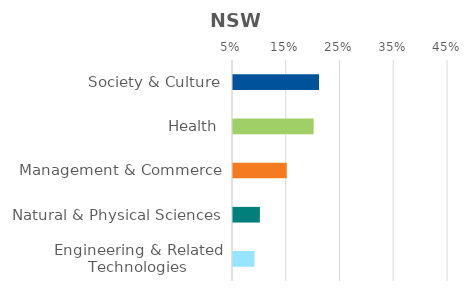
| Category | Series 0 |
|---|---|
| Society & Culture | 0.21 |
| Health | 0.2 |
| Management & Commerce | 0.15 |
| Natural & Physical Sciences | 0.1 |
| Engineering & Related Technologies | 0.09 |